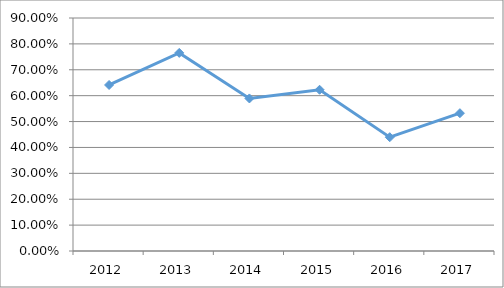
| Category | MECA-D3O12 |
|---|---|
| 2012.0 | 0.641 |
| 2013.0 | 0.765 |
| 2014.0 | 0.589 |
| 2015.0 | 0.623 |
| 2016.0 | 0.44 |
| 2017.0 | 0.532 |